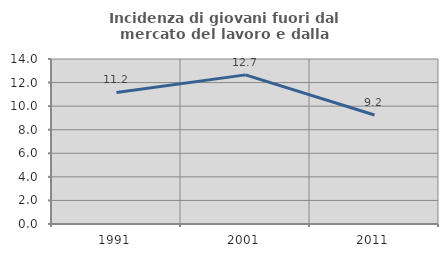
| Category | Incidenza di giovani fuori dal mercato del lavoro e dalla formazione  |
|---|---|
| 1991.0 | 11.166 |
| 2001.0 | 12.652 |
| 2011.0 | 9.248 |